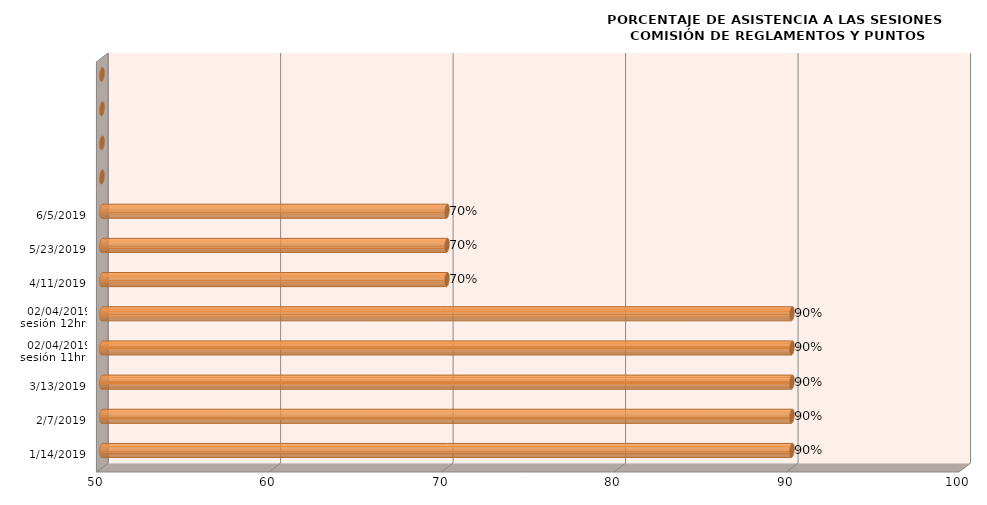
| Category | Series 0 |
|---|---|
| 14/01/2019 | 90 |
| 07/02/2019 | 90 |
| 13/03/2019 | 90 |
| 02/04/2019
sesión 11hrs | 90 |
| 02/04/2019
sesión 12hrs | 90 |
| 11/04/2019 | 70 |
| 23/05/2019 | 70 |
| 05/06/2019 | 70 |